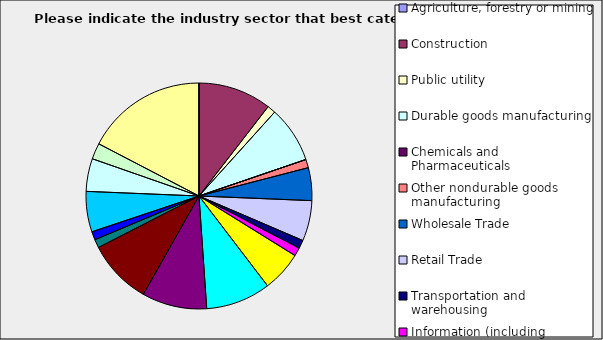
| Category | Series 0 |
|---|---|
| Agriculture, forestry or mining | 0 |
| Construction | 0.105 |
| Public utility | 0.012 |
| Durable goods manufacturing | 0.081 |
| Chemicals and Pharmaceuticals | 0 |
| Other nondurable goods manufacturing | 0.012 |
| Wholesale Trade | 0.047 |
| Retail Trade | 0.058 |
| Transportation and warehousing | 0.012 |
| Information (including broadcasting and telecommunication) | 0.012 |
| Finance and Insurance | 0.058 |
| Real Estate | 0.093 |
| Professional, scientific and technical services | 0.093 |
| Consulting | 0.093 |
| Administrative and office services (including waste management) | 0.012 |
| Education | 0.012 |
| Health Care and social services | 0.058 |
| Arts, entertainment and recreation | 0.047 |
| Accommodation and food services | 0.023 |
| Other | 0.174 |